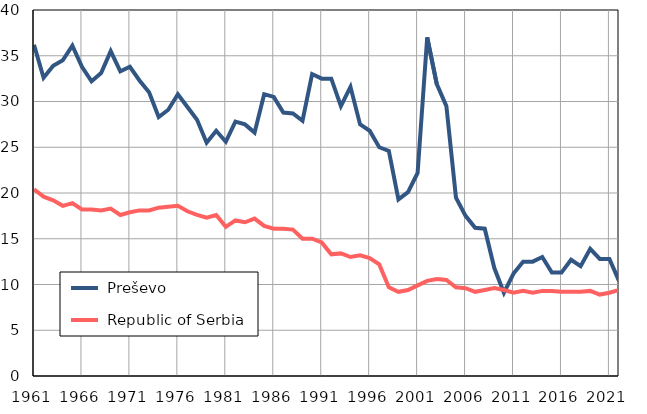
| Category |  Preševo |  Republic of Serbia |
|---|---|---|
| 1961.0 | 36.2 | 20.4 |
| 1962.0 | 32.6 | 19.6 |
| 1963.0 | 33.9 | 19.2 |
| 1964.0 | 34.5 | 18.6 |
| 1965.0 | 36.1 | 18.9 |
| 1966.0 | 33.8 | 18.2 |
| 1967.0 | 32.2 | 18.2 |
| 1968.0 | 33.1 | 18.1 |
| 1969.0 | 35.5 | 18.3 |
| 1970.0 | 33.3 | 17.6 |
| 1971.0 | 33.8 | 17.9 |
| 1972.0 | 32.3 | 18.1 |
| 1973.0 | 31 | 18.1 |
| 1974.0 | 28.3 | 18.4 |
| 1975.0 | 29.1 | 18.5 |
| 1976.0 | 30.8 | 18.6 |
| 1977.0 | 29.4 | 18 |
| 1978.0 | 28 | 17.6 |
| 1979.0 | 25.5 | 17.3 |
| 1980.0 | 26.8 | 17.6 |
| 1981.0 | 25.6 | 16.3 |
| 1982.0 | 27.8 | 17 |
| 1983.0 | 27.5 | 16.8 |
| 1984.0 | 26.6 | 17.2 |
| 1985.0 | 30.8 | 16.4 |
| 1986.0 | 30.5 | 16.1 |
| 1987.0 | 28.8 | 16.1 |
| 1988.0 | 28.7 | 16 |
| 1989.0 | 27.9 | 15 |
| 1990.0 | 33 | 15 |
| 1991.0 | 32.5 | 14.6 |
| 1992.0 | 32.5 | 13.3 |
| 1993.0 | 29.5 | 13.4 |
| 1994.0 | 31.6 | 13 |
| 1995.0 | 27.5 | 13.2 |
| 1996.0 | 26.8 | 12.9 |
| 1997.0 | 25 | 12.2 |
| 1998.0 | 24.6 | 9.7 |
| 1999.0 | 19.3 | 9.2 |
| 2000.0 | 20.1 | 9.4 |
| 2001.0 | 22.2 | 9.9 |
| 2002.0 | 37 | 10.4 |
| 2003.0 | 31.9 | 10.6 |
| 2004.0 | 29.5 | 10.5 |
| 2005.0 | 19.5 | 9.7 |
| 2006.0 | 17.5 | 9.6 |
| 2007.0 | 16.2 | 9.2 |
| 2008.0 | 16.1 | 9.4 |
| 2009.0 | 11.8 | 9.6 |
| 2010.0 | 9.1 | 9.4 |
| 2011.0 | 11.2 | 9.1 |
| 2012.0 | 12.5 | 9.3 |
| 2013.0 | 12.5 | 9.1 |
| 2014.0 | 13 | 9.3 |
| 2015.0 | 11.3 | 9.3 |
| 2016.0 | 11.3 | 9.2 |
| 2017.0 | 12.7 | 9.2 |
| 2018.0 | 12 | 9.2 |
| 2019.0 | 13.9 | 9.3 |
| 2020.0 | 12.8 | 8.9 |
| 2021.0 | 12.8 | 9.1 |
| 2022.0 | 10.4 | 9.4 |